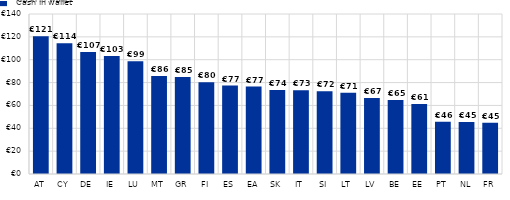
| Category | Series 0 |
|---|---|
| AT | 120.6 |
| CY | 114.4 |
| DE | 106.8 |
| IE | 103.3 |
| LU | 98.6 |
| MT | 85.7 |
| GR | 84.8 |
| FI | 80.3 |
| ES | 77.4 |
| EA | 76.5 |
| SK | 73.6 |
| IT | 73.2 |
| SI | 72.3 |
| LT | 71.1 |
| LV | 66.6 |
| BE | 64.7 |
| EE | 61.2 |
| PT | 45.7 |
| NL | 45.4 |
| FR | 44.8 |